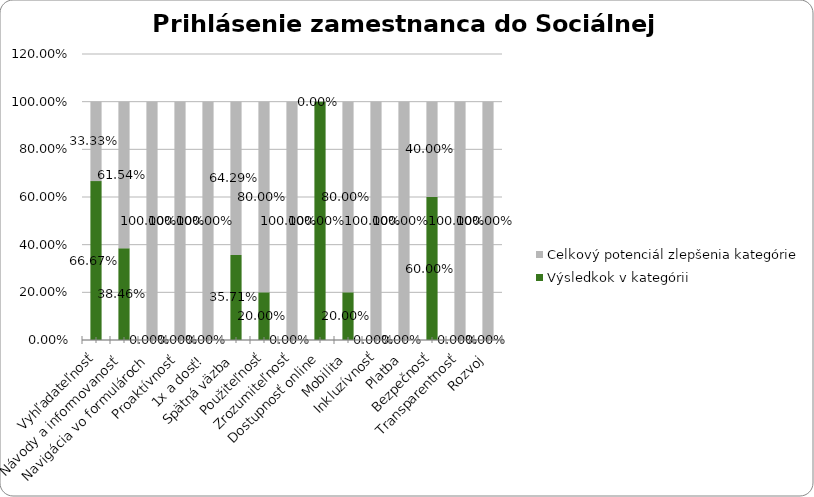
| Category | Výsledkok v kategórii | Celkový potenciál zlepšenia kategórie |
|---|---|---|
| Vyhľadateľnosť | 0.667 | 0.333 |
| Návody a informovanosť | 0.385 | 0.615 |
| Navigácia vo formulároch | 0 | 1 |
| Proaktívnosť | 0 | 1 |
| 1x a dosť! | 0 | 1 |
| Spätná väzba | 0.357 | 0.643 |
| Použiteľnosť | 0.2 | 0.8 |
| Zrozumiteľnosť | 0 | 1 |
| Dostupnosť online | 1 | 0 |
| Mobilita | 0.2 | 0.8 |
| Inkluzívnosť | 0 | 1 |
| Platba | 0 | 1 |
| Bezpečnosť | 0.6 | 0.4 |
| Transparentnosť | 0 | 1 |
| Rozvoj | 0 | 1 |